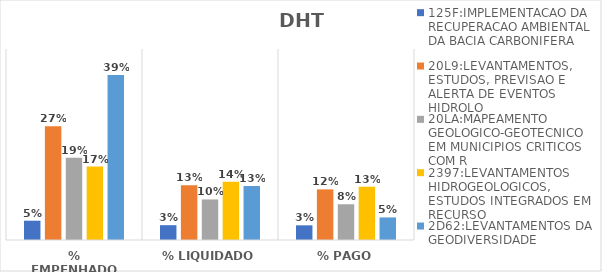
| Category | 125F:IMPLEMENTACAO DA RECUPERACAO AMBIENTAL DA BACIA CARBONIFERA | 20L9:LEVANTAMENTOS, ESTUDOS, PREVISAO E ALERTA DE EVENTOS HIDROLO | 20LA:MAPEAMENTO GEOLOGICO-GEOTECNICO EM MUNICIPIOS CRITICOS COM R | 2397:LEVANTAMENTOS HIDROGEOLOGICOS, ESTUDOS INTEGRADOS EM RECURSO | 2D62:LEVANTAMENTOS DA GEODIVERSIDADE |
|---|---|---|---|---|---|
| % EMPENHADO | 0.045 | 0.268 | 0.194 | 0.173 | 0.389 |
| % LIQUIDADO | 0.035 | 0.129 | 0.096 | 0.137 | 0.127 |
| % PAGO | 0.035 | 0.119 | 0.084 | 0.125 | 0.053 |